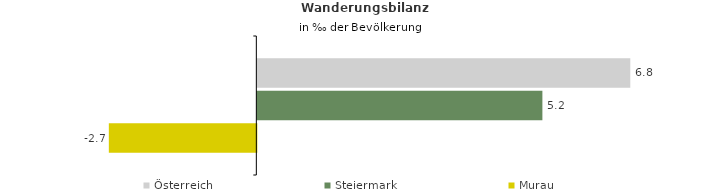
| Category | Österreich | Steiermark | Murau |
|---|---|---|---|
| Wanderungsrate in ‰ der Bevölkerung, Periode 2015-2019 | 6.771 | 5.175 | -2.678 |